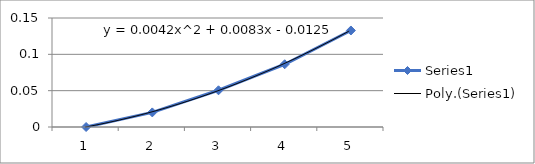
| Category | Series 0 |
|---|---|
| 0 | 0 |
| 1 | 0.02 |
| 2 | 0.051 |
| 3 | 0.086 |
| 4 | 0.133 |